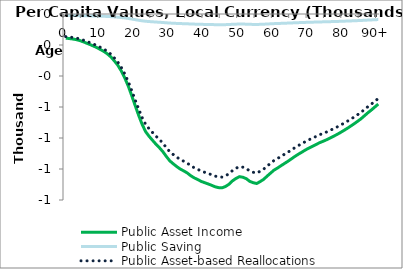
| Category | Public Asset Income | Public Saving | Public Asset-based Reallocations |
|---|---|---|---|
| 0 | -155.414 | -9.592 | -145.82 |
|  | -158.312 | -9.771 | -148.539 |
| 2 | -161.21 | -9.949 | -151.258 |
| 3 | -165.221 | -10.197 | -155.021 |
| 4 | -170.985 | -10.553 | -160.43 |
| 5 | -178.941 | -11.044 | -167.894 |
| 6 | -188.014 | -11.604 | -176.408 |
| 7 | -197.079 | -12.163 | -184.913 |
| 8 | -206.967 | -12.773 | -194.19 |
| 9 | -216.951 | -13.39 | -203.558 |
| 10 | -229.251 | -14.149 | -215.098 |
| 11 | -241.563 | -14.909 | -226.651 |
| 12 | -257.379 | -15.885 | -241.49 |
| 13 | -276.895 | -17.089 | -259.801 |
| 14 | -302.333 | -18.659 | -283.669 |
| 15 | -330.652 | -20.407 | -310.24 |
| 16 | -367.662 | -22.691 | -344.966 |
| 17 | -412.188 | -25.439 | -386.742 |
| 18 | -464.814 | -28.687 | -436.12 |
| 19 | -526.227 | -32.477 | -493.742 |
| 20 | -590.699 | -36.456 | -554.234 |
| 21 | -653.671 | -40.343 | -613.318 |
| 22 | -711.885 | -43.936 | -667.938 |
| 23 | -758.763 | -46.829 | -711.922 |
| 24 | -788.81 | -48.683 | -740.115 |
| 25 | -815.014 | -50.3 | -764.701 |
| 26 | -840.392 | -51.867 | -788.512 |
| 27 | -863.328 | -53.282 | -810.032 |
| 28 | -889.007 | -54.867 | -834.126 |
| 29 | -920.013 | -56.781 | -863.218 |
| 30 | -948.132 | -58.516 | -889.601 |
| 31 | -967.173 | -59.691 | -907.466 |
| 32 | -984.804 | -60.779 | -924.01 |
| 33 | -1000.668 | -61.758 | -938.894 |
| 34 | -1012.42 | -62.484 | -949.921 |
| 35 | -1025.645 | -63.3 | -962.329 |
| 36 | -1043.304 | -64.39 | -978.898 |
| 37 | -1057.272 | -65.252 | -992.003 |
| 38 | -1067.809 | -65.902 | -1001.89 |
| 39 | -1079.929 | -66.65 | -1013.262 |
| 40 | -1088.107 | -67.155 | -1020.935 |
| 41 | -1096.271 | -67.659 | -1028.595 |
| 42 | -1105.031 | -68.199 | -1036.815 |
| 43 | -1114.717 | -68.797 | -1045.902 |
| 44 | -1120.127 | -69.131 | -1050.978 |
| 45 | -1121.64 | -69.224 | -1052.398 |
| 46 | -1112.984 | -68.69 | -1044.276 |
| 47 | -1098.518 | -67.797 | -1030.703 |
| 48 | -1076.907 | -66.464 | -1010.426 |
| 49 | -1061.25 | -65.497 | -995.736 |
| 50 | -1049.549 | -64.775 | -984.757 |
| 51 | -1053.098 | -64.994 | -988.087 |
| 52 | -1062.544 | -65.577 | -996.95 |
| 53 | -1079.844 | -66.645 | -1013.182 |
| 54 | -1088.477 | -67.178 | -1021.282 |
| 55 | -1093.645 | -67.497 | -1026.132 |
| 56 | -1081.008 | -66.717 | -1014.274 |
| 57 | -1066.681 | -65.833 | -1000.831 |
| 58 | -1045.77 | -64.542 | -981.211 |
| 59 | -1026.162 | -63.332 | -962.814 |
| 60 | -1006.826 | -62.138 | -944.672 |
| 61 | -993.627 | -61.324 | -932.288 |
| 62 | -978.687 | -60.402 | -918.27 |
| 63 | -964.274 | -59.512 | -904.747 |
| 64 | -949.915 | -58.626 | -891.274 |
| 65 | -934.385 | -57.668 | -876.703 |
| 66 | -918.874 | -56.71 | -862.149 |
| 67 | -904.432 | -55.819 | -848.598 |
| 68 | -891.237 | -55.005 | -836.218 |
| 69 | -877.553 | -54.16 | -823.379 |
| 70 | -865.256 | -53.401 | -811.841 |
| 71 | -854.428 | -52.733 | -801.682 |
| 72 | -842.994 | -52.027 | -790.953 |
| 73 | -831.409 | -51.312 | -780.084 |
| 74 | -822.185 | -50.743 | -771.429 |
| 75 | -812.421 | -50.14 | -762.268 |
| 76 | -801.671 | -49.477 | -752.181 |
| 77 | -790.16 | -48.766 | -741.381 |
| 78 | -778.675 | -48.058 | -730.605 |
| 79 | -766.019 | -47.277 | -718.731 |
| 80 | -752.706 | -46.455 | -706.239 |
| 81 | -738.708 | -45.591 | -693.106 |
| 82 | -724.093 | -44.689 | -679.393 |
| 83 | -709.102 | -43.764 | -665.327 |
| 84 | -692.995 | -42.77 | -650.215 |
| 85 | -676.657 | -41.761 | -634.885 |
| 86 | -657.006 | -40.549 | -616.447 |
| 87 | -637.512 | -39.345 | -598.157 |
| 88 | -619.567 | -38.238 | -581.319 |
| 89 | -600.375 | -37.053 | -563.312 |
| 90+ | -581.183 | -35.869 | -545.305 |